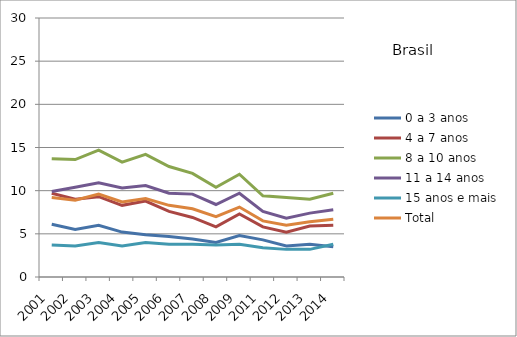
| Category | 0 a 3 anos | 4 a 7 anos | 8 a 10 anos | 11 a 14 anos | 15 anos e mais | Total |
|---|---|---|---|---|---|---|
| 2001.0 | 6.1 | 9.7 | 13.7 | 9.9 | 3.7 | 9.2 |
| 2002.0 | 5.5 | 9 | 13.6 | 10.4 | 3.6 | 8.9 |
| 2003.0 | 6 | 9.3 | 14.7 | 10.9 | 4 | 9.6 |
| 2004.0 | 5.2 | 8.3 | 13.3 | 10.3 | 3.6 | 8.7 |
| 2005.0 | 4.9 | 8.8 | 14.2 | 10.6 | 4 | 9.1 |
| 2006.0 | 4.7 | 7.6 | 12.8 | 9.7 | 3.8 | 8.3 |
| 2007.0 | 4.4 | 6.9 | 12 | 9.6 | 3.8 | 7.9 |
| 2008.0 | 4 | 5.8 | 10.4 | 8.4 | 3.7 | 7 |
| 2009.0 | 4.8 | 7.3 | 11.9 | 9.7 | 3.8 | 8.1 |
| 2011.0 | 4.3 | 5.8 | 9.4 | 7.6 | 3.4 | 6.5 |
| 2012.0 | 3.6 | 5.2 | 9.2 | 6.8 | 3.2 | 6 |
| 2013.0 | 3.8 | 5.9 | 9 | 7.4 | 3.2 | 6.4 |
| 2014.0 | 3.5 | 6 | 9.7 | 7.8 | 3.8 | 6.7 |